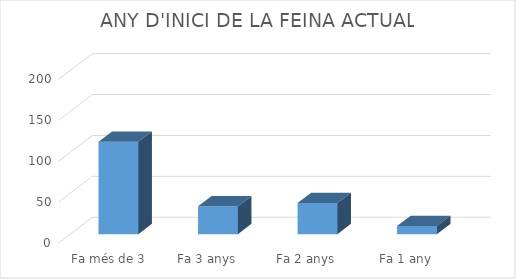
| Category | Series 0 |
|---|---|
| Fa més de 3 anys | 113 |
| Fa 3 anys | 34 |
| Fa 2 anys | 38 |
| Fa 1 any | 10 |